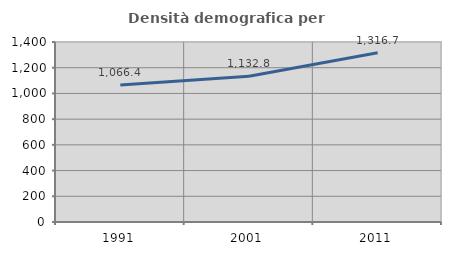
| Category | Densità demografica |
|---|---|
| 1991.0 | 1066.43 |
| 2001.0 | 1132.842 |
| 2011.0 | 1316.657 |